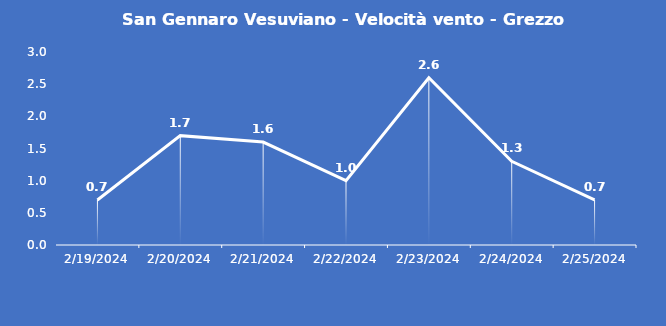
| Category | San Gennaro Vesuviano - Velocità vento - Grezzo (m/s) |
|---|---|
| 2/19/24 | 0.7 |
| 2/20/24 | 1.7 |
| 2/21/24 | 1.6 |
| 2/22/24 | 1 |
| 2/23/24 | 2.6 |
| 2/24/24 | 1.3 |
| 2/25/24 | 0.7 |